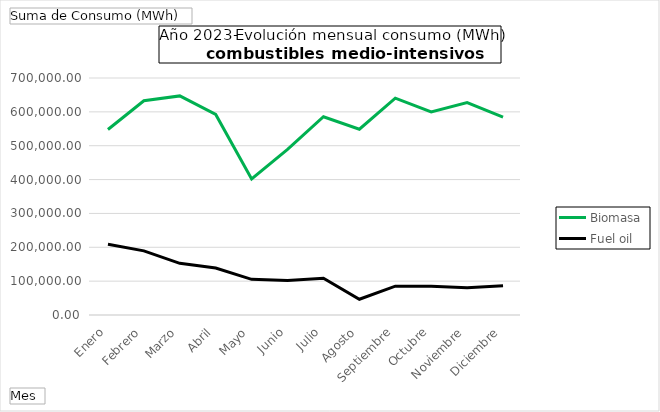
| Category | Biomasa | Fuel oil |
|---|---|---|
| Enero | 547911.48 | 208972.59 |
| Febrero | 632710.39 | 189361.39 |
| Marzo | 647133.04 | 152595.44 |
| Abril | 592220.32 | 138620.61 |
| Mayo | 401991.18 | 105395.08 |
| Junio | 489073.34 | 101903.28 |
| Julio | 585523.68 | 108603.18 |
| Agosto | 548693.26 | 46547.58 |
| Septiembre | 640572.96 | 85266.44 |
| Octubre | 599844.29 | 85128.17 |
| Noviembre | 627199.65 | 80656.12 |
| Diciembre | 584620.29 | 86037 |